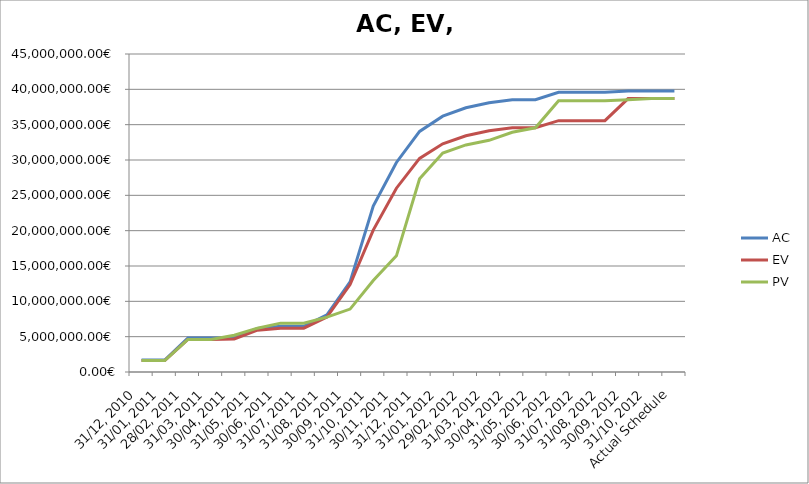
| Category | AC | EV | PV |
|---|---|---|---|
| 31/12, 2010 | 1695199.155 | 1627216.125 | 1627216.125 |
| 31/01, 2011 | 1695199.155 | 1627216.125 | 1627216.125 |
| 28/02, 2011 | 4793843.764 | 4601594.875 | 4601594.875 |
| 31/03, 2011 | 4793843.764 | 4601594.875 | 4601594.875 |
| 30/04, 2011 | 4864275.414 | 4669201.984 | 5209025.797 |
| 31/05, 2011 | 6166622.117 | 5919320.297 | 6203438.078 |
| 30/06, 2011 | 6462609.988 | 6203438.078 | 6913732.578 |
| 31/07, 2011 | 6462609.988 | 6203438.078 | 6913732.578 |
| 31/08, 2011 | 8090543.283 | 7766085.953 | 7766085.953 |
| 30/09, 2011 | 12758538.814 | 12380021.125 | 8902557.078 |
| 31/10, 2011 | 23473919.652 | 20077038.992 | 12948256.688 |
| 30/11, 2011 | 29653690.57 | 26008980.797 | 16440789.062 |
| 31/12, 2011 | 34050365.332 | 30229334.422 | 27342551.562 |
| 31/01, 2012 | 36205287.49 | 32297837.109 | 30994669.625 |
| 29/02, 2012 | 37389238.955 | 33434308.234 | 32131140.75 |
| 31/03, 2012 | 38108822.782 | 34144404.281 | 32782724.492 |
| 30/04, 2012 | 38538974.729 | 34557305.719 | 33917308.484 |
| 31/05, 2012 | 38538974.729 | 34557305.719 | 34557305.719 |
| 30/06, 2012 | 39592982.587 | 35569044.387 | 38382492.574 |
| 31/07, 2012 | 39592982.587 | 35569044.387 | 38382492.574 |
| 31/08, 2012 | 39592982.587 | 35569044.387 | 38382492.574 |
| 30/09, 2012 | 39776643.301 | 38696822.73 | 38520126.387 |
| 31/10, 2012 | 39777643.301 | 38697822.73 | 38696822.73 |
| Actual Schedule | 39777643.301 | 38697822.73 | 38697822.73 |